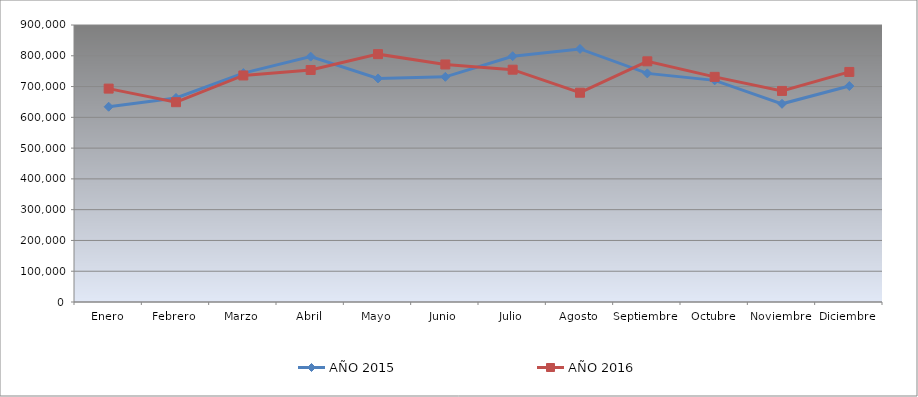
| Category | AÑO 2015 | AÑO 2016 |
|---|---|---|
| Enero | 634480 | 693360 |
| Febrero | 662940 | 649160 |
| Marzo | 743820 | 736040 |
| Abril | 797220 | 753880 |
| Mayo | 726380 | 805300 |
| Junio | 731580 | 771780 |
| Julio | 798640 | 754840 |
| Agosto | 822260 | 680010 |
| Septiembre | 742780 | 781980 |
| Octubre | 720160 | 731540 |
| Noviembre | 643940 | 685820 |
| Diciembre | 701700 | 747530 |